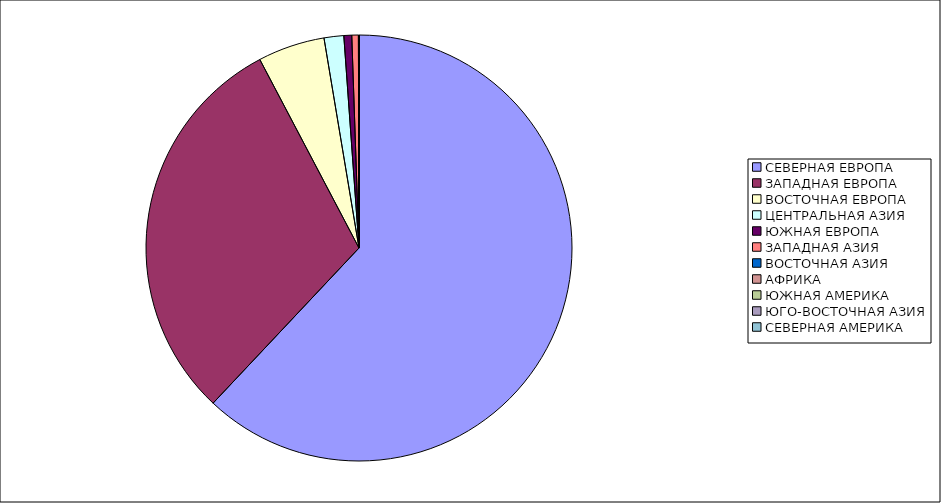
| Category | Оборот |
|---|---|
| СЕВЕРНАЯ ЕВРОПА | 62.011 |
| ЗАПАДНАЯ ЕВРОПА | 30.278 |
| ВОСТОЧНАЯ ЕВРОПА | 5.079 |
| ЦЕНТРАЛЬНАЯ АЗИЯ | 1.494 |
| ЮЖНАЯ ЕВРОПА | 0.595 |
| ЗАПАДНАЯ АЗИЯ | 0.498 |
| ВОСТОЧНАЯ АЗИЯ | 0.027 |
| АФРИКА | 0.014 |
| ЮЖНАЯ АМЕРИКА | 0.003 |
| ЮГО-ВОСТОЧНАЯ АЗИЯ | 0.001 |
| СЕВЕРНАЯ АМЕРИКА | 0 |